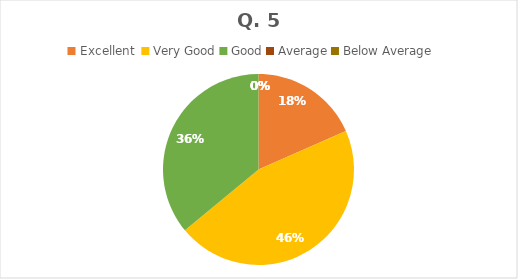
| Category | Series 0 |
|---|---|
| Excellent  | 23 |
| Very Good | 57 |
| Good | 45 |
| Average | 0 |
| Below Average | 0 |